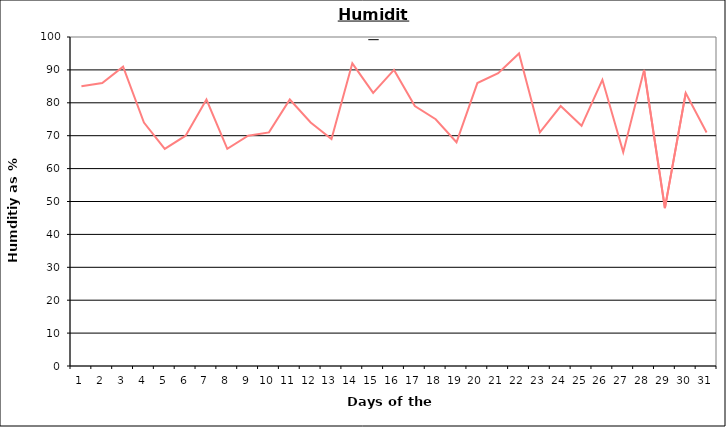
| Category | Series 0 |
|---|---|
| 0 | 85 |
| 1 | 86 |
| 2 | 91 |
| 3 | 74 |
| 4 | 66 |
| 5 | 70 |
| 6 | 81 |
| 7 | 66 |
| 8 | 70 |
| 9 | 71 |
| 10 | 81 |
| 11 | 74 |
| 12 | 69 |
| 13 | 92 |
| 14 | 83 |
| 15 | 90 |
| 16 | 79 |
| 17 | 75 |
| 18 | 68 |
| 19 | 86 |
| 20 | 89 |
| 21 | 95 |
| 22 | 71 |
| 23 | 79 |
| 24 | 73 |
| 25 | 87 |
| 26 | 65 |
| 27 | 90 |
| 28 | 48 |
| 29 | 83 |
| 30 | 71 |